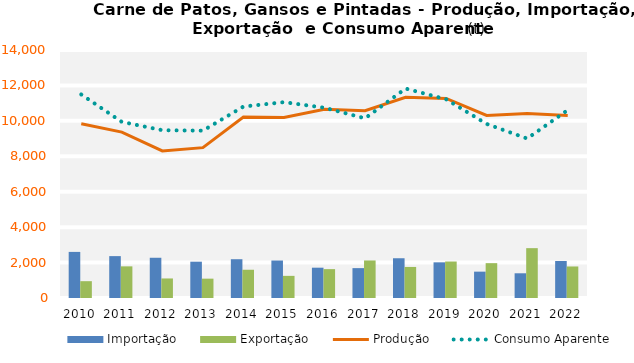
| Category | Importação | Exportação |
|---|---|---|
| 0 | 2602.474 | 949.539 |
| 1 | 2364.35 | 1786.197 |
| 2 | 2271.746 | 1103.199 |
| 3 | 2049.677 | 1092.092 |
| 4 | 2189.483 | 1594.512 |
| 5 | 2115.659 | 1249.589 |
| 6 | 1711.067 | 1629.711 |
| 7 | 1686.593 | 2118.798 |
| 8 | 2244.271 | 1753.114 |
| 9 | 2013.48 | 2059.334 |
| 10 | 1487.703 | 1967.34 |
| 11 | 1395.303 | 2813.729 |
| 12 | 2090.016 | 1779.871 |